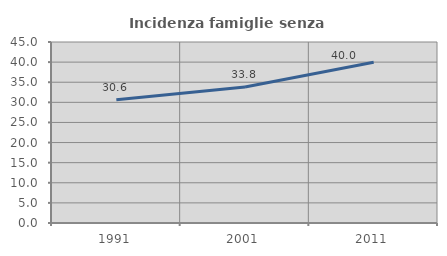
| Category | Incidenza famiglie senza nuclei |
|---|---|
| 1991.0 | 30.628 |
| 2001.0 | 33.835 |
| 2011.0 | 39.981 |